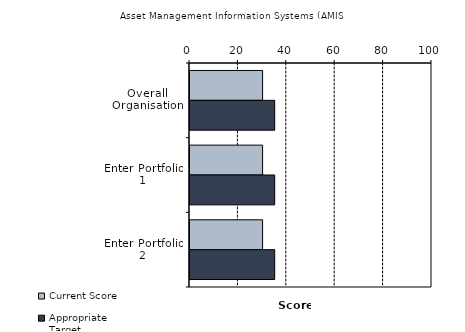
| Category | Current Score | Appropriate Target |
|---|---|---|
| Overall Organisation | 30 | 35 |
| Enter Portfolio 1 | 30 | 35 |
| Enter Portfolio 2 | 30 | 35 |